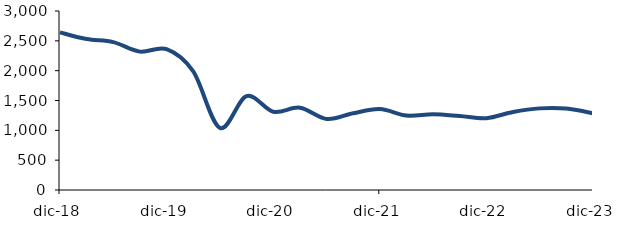
| Category | Series 1 |
|---|---|
| 2018-12-01 | 2642.761 |
| 2019-03-01 | 2529.58 |
| 2019-06-01 | 2478.002 |
| 2019-09-01 | 2318.926 |
| 2019-12-01 | 2360.025 |
| 2020-03-01 | 1986.731 |
| 2020-06-01 | 1041.097 |
| 2020-09-01 | 1574.171 |
| 2020-12-01 | 1312.483 |
| 2021-03-01 | 1379.069 |
| 2021-06-01 | 1191.512 |
| 2021-09-01 | 1286.989 |
| 2021-12-01 | 1355.491 |
| 2022-03-01 | 1246.738 |
| 2022-06-01 | 1268.356 |
| 2022-09-01 | 1239.715 |
| 2022-12-01 | 1203.926 |
| 2023-03-01 | 1308.462 |
| 2023-06-01 | 1367.986 |
| 2023-09-01 | 1364.608 |
| 2023-12-01 | 1285.697 |